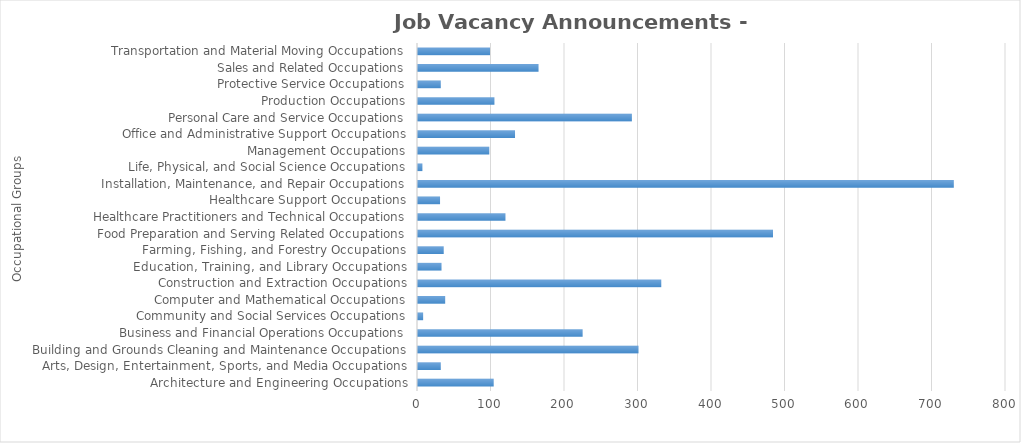
| Category | Total JVAs |
|---|---|
| Architecture and Engineering Occupations | 103 |
| Arts, Design, Entertainment, Sports, and Media Occupations | 31 |
| Building and Grounds Cleaning and Maintenance Occupations | 300 |
| Business and Financial Operations Occupations | 224 |
| Community and Social Services Occupations | 7 |
| Computer and Mathematical Occupations | 37 |
| Construction and Extraction Occupations | 331 |
| Education, Training, and Library Occupations | 32 |
| Farming, Fishing, and Forestry Occupations | 35 |
| Food Preparation and Serving Related Occupations | 483 |
| Healthcare Practitioners and Technical Occupations | 119 |
| Healthcare Support Occupations | 30 |
| Installation, Maintenance, and Repair Occupations | 729 |
| Life, Physical, and Social Science Occupations | 6 |
| Management Occupations | 97 |
| Office and Administrative Support Occupations | 132 |
| Personal Care and Service Occupations | 291 |
| Production Occupations | 104 |
| Protective Service Occupations | 31 |
| Sales and Related Occupations | 164 |
| Transportation and Material Moving Occupations | 98 |